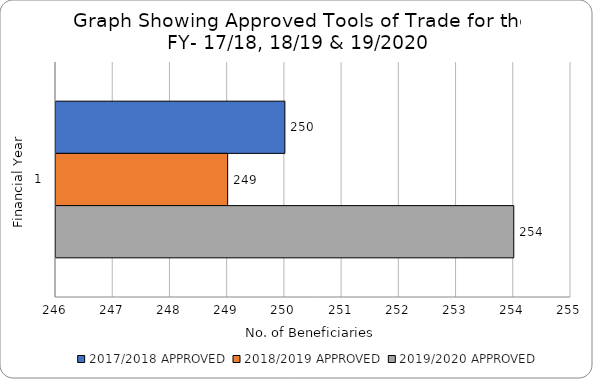
| Category | 2017/2018 APPROVED | 2018/2019 APPROVED | 2019/2020 APPROVED |
|---|---|---|---|
| 0 | 250 | 249 | 254 |